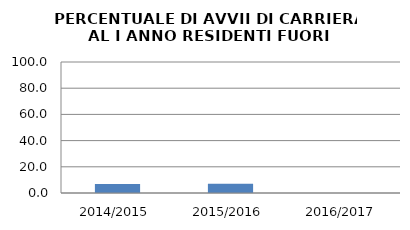
| Category | 2014/2015 2015/2016 2016/2017 |
|---|---|
| 2014/2015 | 6.897 |
| 2015/2016 | 7.143 |
| 2016/2017 | 0 |